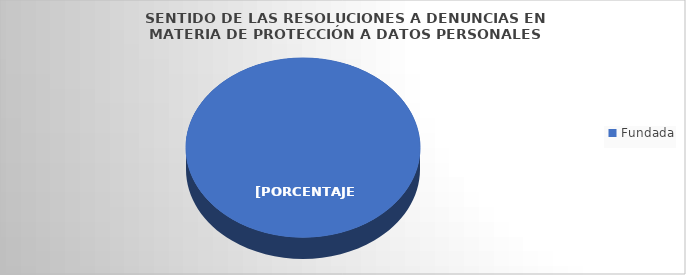
| Category | Series 0 |
|---|---|
| Fundada  | 2 |